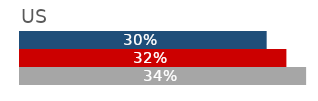
| Category | US |
|---|---|
| 2006 | 0.3 |
| 2011 | 0.32 |
| 2016 | 0.34 |